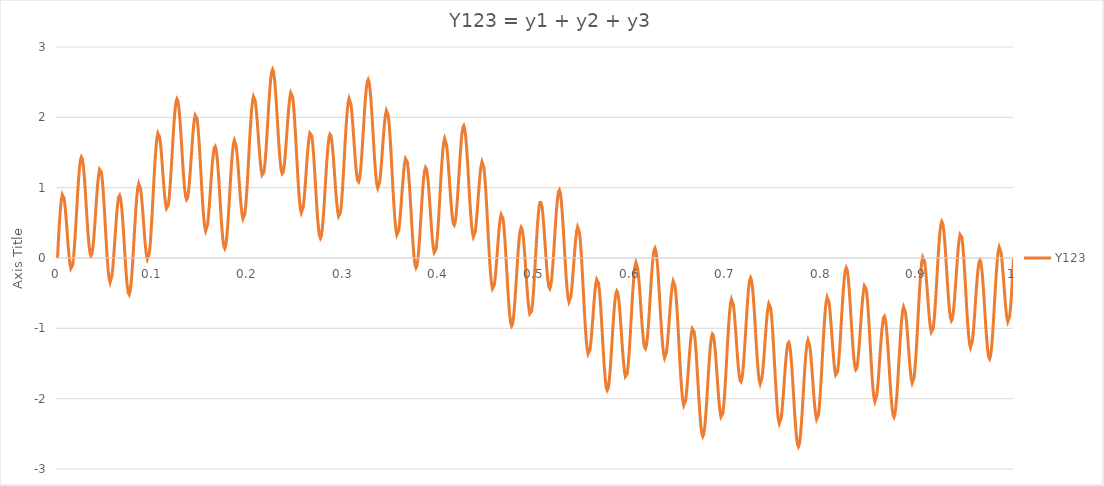
| Category | Y123 |
|---|---|
| 0.0 | 0 |
| 0.001 | 0.257 |
| 0.002 | 0.493 |
| 0.003 | 0.688 |
| 0.004 | 0.828 |
| 0.005 | 0.902 |
| 0.006 | 0.906 |
| 0.007 | 0.845 |
| 0.008 | 0.728 |
| 0.009000000000000001 | 0.569 |
| 0.010000000000000002 | 0.388 |
| 0.011000000000000003 | 0.206 |
| 0.012000000000000004 | 0.044 |
| 0.013000000000000005 | -0.079 |
| 0.014000000000000005 | -0.149 |
| 0.015000000000000006 | -0.154 |
| 0.016000000000000007 | -0.093 |
| 0.017000000000000008 | 0.032 |
| 0.01800000000000001 | 0.21 |
| 0.01900000000000001 | 0.427 |
| 0.02000000000000001 | 0.664 |
| 0.02100000000000001 | 0.898 |
| 0.022000000000000013 | 1.109 |
| 0.023000000000000013 | 1.278 |
| 0.024000000000000014 | 1.39 |
| 0.025000000000000015 | 1.435 |
| 0.026000000000000016 | 1.409 |
| 0.027000000000000017 | 1.316 |
| 0.028000000000000018 | 1.165 |
| 0.02900000000000002 | 0.972 |
| 0.03000000000000002 | 0.757 |
| 0.03100000000000002 | 0.539 |
| 0.03200000000000002 | 0.341 |
| 0.03300000000000002 | 0.181 |
| 0.03400000000000002 | 0.074 |
| 0.035000000000000024 | 0.032 |
| 0.036000000000000025 | 0.056 |
| 0.037000000000000026 | 0.144 |
| 0.03800000000000003 | 0.286 |
| 0.03900000000000003 | 0.466 |
| 0.04000000000000003 | 0.667 |
| 0.04100000000000003 | 0.866 |
| 0.04200000000000003 | 1.044 |
| 0.04300000000000003 | 1.18 |
| 0.04400000000000003 | 1.259 |
| 0.04500000000000003 | 1.273 |
| 0.046000000000000034 | 1.218 |
| 0.047000000000000035 | 1.097 |
| 0.048000000000000036 | 0.92 |
| 0.04900000000000004 | 0.702 |
| 0.05000000000000004 | 0.464 |
| 0.05100000000000004 | 0.225 |
| 0.05200000000000004 | 0.007 |
| 0.05300000000000004 | -0.17 |
| 0.05400000000000004 | -0.291 |
| 0.05500000000000004 | -0.346 |
| 0.05600000000000004 | -0.333 |
| 0.057000000000000044 | -0.253 |
| 0.058000000000000045 | -0.118 |
| 0.059000000000000045 | 0.059 |
| 0.060000000000000046 | 0.258 |
| 0.06100000000000005 | 0.459 |
| 0.06200000000000005 | 0.639 |
| 0.06300000000000004 | 0.78 |
| 0.06400000000000004 | 0.868 |
| 0.06500000000000004 | 0.891 |
| 0.06600000000000004 | 0.848 |
| 0.06700000000000005 | 0.741 |
| 0.06800000000000005 | 0.581 |
| 0.06900000000000005 | 0.382 |
| 0.07000000000000005 | 0.163 |
| 0.07100000000000005 | -0.053 |
| 0.07200000000000005 | -0.247 |
| 0.07300000000000005 | -0.398 |
| 0.07400000000000005 | -0.492 |
| 0.07500000000000005 | -0.519 |
| 0.07600000000000005 | -0.475 |
| 0.07700000000000005 | -0.365 |
| 0.07800000000000006 | -0.197 |
| 0.07900000000000006 | 0.014 |
| 0.08000000000000006 | 0.247 |
| 0.08100000000000006 | 0.482 |
| 0.08200000000000006 | 0.698 |
| 0.08300000000000006 | 0.875 |
| 0.08400000000000006 | 0.999 |
| 0.08500000000000006 | 1.059 |
| 0.08600000000000006 | 1.052 |
| 0.08700000000000006 | 0.982 |
| 0.08800000000000006 | 0.857 |
| 0.08900000000000007 | 0.693 |
| 0.09000000000000007 | 0.51 |
| 0.09100000000000007 | 0.327 |
| 0.09200000000000007 | 0.167 |
| 0.09300000000000007 | 0.048 |
| 0.09400000000000007 | -0.014 |
| 0.09500000000000007 | -0.011 |
| 0.09600000000000007 | 0.061 |
| 0.09700000000000007 | 0.199 |
| 0.09800000000000007 | 0.392 |
| 0.09900000000000007 | 0.626 |
| 0.10000000000000007 | 0.882 |
| 0.10100000000000008 | 1.137 |
| 0.10200000000000008 | 1.371 |
| 0.10300000000000008 | 1.564 |
| 0.10400000000000008 | 1.702 |
| 0.10500000000000008 | 1.774 |
| 0.10600000000000008 | 1.777 |
| 0.10700000000000008 | 1.713 |
| 0.10800000000000008 | 1.594 |
| 0.10900000000000008 | 1.433 |
| 0.11000000000000008 | 1.25 |
| 0.11100000000000008 | 1.066 |
| 0.11200000000000009 | 0.901 |
| 0.11300000000000009 | 0.776 |
| 0.11400000000000009 | 0.704 |
| 0.11500000000000009 | 0.696 |
| 0.11600000000000009 | 0.755 |
| 0.11700000000000009 | 0.878 |
| 0.11800000000000009 | 1.054 |
| 0.11900000000000009 | 1.269 |
| 0.12000000000000009 | 1.502 |
| 0.1210000000000001 | 1.734 |
| 0.1220000000000001 | 1.943 |
| 0.1230000000000001 | 2.11 |
| 0.1240000000000001 | 2.219 |
| 0.12500000000000008 | 2.261 |
| 0.12600000000000008 | 2.232 |
| 0.12700000000000009 | 2.136 |
| 0.12800000000000009 | 1.983 |
| 0.1290000000000001 | 1.788 |
| 0.1300000000000001 | 1.569 |
| 0.1310000000000001 | 1.348 |
| 0.1320000000000001 | 1.147 |
| 0.1330000000000001 | 0.984 |
| 0.1340000000000001 | 0.875 |
| 0.1350000000000001 | 0.83 |
| 0.1360000000000001 | 0.851 |
| 0.1370000000000001 | 0.936 |
| 0.1380000000000001 | 1.074 |
| 0.1390000000000001 | 1.252 |
| 0.1400000000000001 | 1.45 |
| 0.1410000000000001 | 1.646 |
| 0.1420000000000001 | 1.82 |
| 0.1430000000000001 | 1.953 |
| 0.1440000000000001 | 2.029 |
| 0.1450000000000001 | 2.04 |
| 0.1460000000000001 | 1.981 |
| 0.1470000000000001 | 1.857 |
| 0.1480000000000001 | 1.676 |
| 0.1490000000000001 | 1.456 |
| 0.1500000000000001 | 1.214 |
| 0.1510000000000001 | 0.971 |
| 0.1520000000000001 | 0.75 |
| 0.1530000000000001 | 0.57 |
| 0.1540000000000001 | 0.445 |
| 0.1550000000000001 | 0.386 |
| 0.1560000000000001 | 0.396 |
| 0.1570000000000001 | 0.472 |
| 0.1580000000000001 | 0.604 |
| 0.1590000000000001 | 0.777 |
| 0.16000000000000011 | 0.973 |
| 0.16100000000000012 | 1.169 |
| 0.16200000000000012 | 1.346 |
| 0.16300000000000012 | 1.483 |
| 0.16400000000000012 | 1.567 |
| 0.16500000000000012 | 1.587 |
| 0.16600000000000012 | 1.539 |
| 0.16700000000000012 | 1.429 |
| 0.16800000000000012 | 1.264 |
| 0.16900000000000012 | 1.061 |
| 0.17000000000000012 | 0.839 |
| 0.17100000000000012 | 0.618 |
| 0.17200000000000013 | 0.421 |
| 0.17300000000000013 | 0.265 |
| 0.17400000000000013 | 0.167 |
| 0.17500000000000013 | 0.137 |
| 0.17600000000000013 | 0.176 |
| 0.17700000000000013 | 0.283 |
| 0.17800000000000013 | 0.447 |
| 0.17900000000000013 | 0.653 |
| 0.18000000000000013 | 0.882 |
| 0.18100000000000013 | 1.113 |
| 0.18200000000000013 | 1.324 |
| 0.18300000000000013 | 1.497 |
| 0.18400000000000014 | 1.616 |
| 0.18500000000000014 | 1.672 |
| 0.18600000000000014 | 1.661 |
| 0.18700000000000014 | 1.586 |
| 0.18800000000000014 | 1.457 |
| 0.18900000000000014 | 1.289 |
| 0.19000000000000014 | 1.101 |
| 0.19100000000000014 | 0.914 |
| 0.19200000000000014 | 0.749 |
| 0.19300000000000014 | 0.626 |
| 0.19400000000000014 | 0.558 |
| 0.19500000000000015 | 0.557 |
| 0.19600000000000015 | 0.624 |
| 0.19700000000000015 | 0.758 |
| 0.19800000000000015 | 0.947 |
| 0.19900000000000015 | 1.176 |
| 0.20000000000000015 | 1.427 |
| 0.20100000000000015 | 1.677 |
| 0.20200000000000015 | 1.906 |
| 0.20300000000000015 | 2.095 |
| 0.20400000000000015 | 2.228 |
| 0.20500000000000015 | 2.295 |
| 0.20600000000000016 | 2.293 |
| 0.20700000000000016 | 2.225 |
| 0.20800000000000016 | 2.1 |
| 0.20900000000000016 | 1.935 |
| 0.21000000000000016 | 1.747 |
| 0.21100000000000016 | 1.558 |
| 0.21200000000000016 | 1.388 |
| 0.21300000000000016 | 1.258 |
| 0.21400000000000016 | 1.181 |
| 0.21500000000000016 | 1.168 |
| 0.21600000000000016 | 1.222 |
| 0.21700000000000016 | 1.34 |
| 0.21800000000000017 | 1.511 |
| 0.21900000000000017 | 1.72 |
| 0.22000000000000017 | 1.949 |
| 0.22100000000000017 | 2.176 |
| 0.22200000000000017 | 2.379 |
| 0.22300000000000017 | 2.541 |
| 0.22400000000000017 | 2.645 |
| 0.22500000000000017 | 2.682 |
| 0.22600000000000017 | 2.648 |
| 0.22700000000000017 | 2.547 |
| 0.22800000000000017 | 2.388 |
| 0.22900000000000018 | 2.188 |
| 0.23000000000000018 | 1.964 |
| 0.23100000000000018 | 1.738 |
| 0.23200000000000018 | 1.531 |
| 0.23300000000000018 | 1.363 |
| 0.23400000000000018 | 1.249 |
| 0.23500000000000018 | 1.198 |
| 0.23600000000000018 | 1.214 |
| 0.23700000000000018 | 1.293 |
| 0.23800000000000018 | 1.427 |
| 0.23900000000000018 | 1.599 |
| 0.24000000000000019 | 1.791 |
| 0.2410000000000002 | 1.982 |
| 0.2420000000000002 | 2.15 |
| 0.2430000000000002 | 2.278 |
| 0.2440000000000002 | 2.349 |
| 0.2450000000000002 | 2.354 |
| 0.2460000000000002 | 2.29 |
| 0.2470000000000002 | 2.16 |
| 0.2480000000000002 | 1.974 |
| 0.2490000000000002 | 1.748 |
| 0.25000000000000017 | 1.5 |
| 0.25100000000000017 | 1.252 |
| 0.25200000000000017 | 1.026 |
| 0.25300000000000017 | 0.84 |
| 0.25400000000000017 | 0.709 |
| 0.25500000000000017 | 0.645 |
| 0.25600000000000017 | 0.649 |
| 0.2570000000000002 | 0.719 |
| 0.2580000000000002 | 0.846 |
| 0.2590000000000002 | 1.013 |
| 0.2600000000000002 | 1.203 |
| 0.2610000000000002 | 1.394 |
| 0.2620000000000002 | 1.565 |
| 0.2630000000000002 | 1.697 |
| 0.2640000000000002 | 1.775 |
| 0.2650000000000002 | 1.789 |
| 0.2660000000000002 | 1.736 |
| 0.2670000000000002 | 1.62 |
| 0.2680000000000002 | 1.449 |
| 0.2690000000000002 | 1.241 |
| 0.2700000000000002 | 1.013 |
| 0.2710000000000002 | 0.786 |
| 0.2720000000000002 | 0.583 |
| 0.2730000000000002 | 0.422 |
| 0.2740000000000002 | 0.318 |
| 0.2750000000000002 | 0.282 |
| 0.2760000000000002 | 0.315 |
| 0.2770000000000002 | 0.416 |
| 0.2780000000000002 | 0.574 |
| 0.2790000000000002 | 0.775 |
| 0.2800000000000002 | 0.998 |
| 0.2810000000000002 | 1.223 |
| 0.2820000000000002 | 1.429 |
| 0.2830000000000002 | 1.596 |
| 0.2840000000000002 | 1.709 |
| 0.2850000000000002 | 1.759 |
| 0.2860000000000002 | 1.742 |
| 0.2870000000000002 | 1.661 |
| 0.2880000000000002 | 1.527 |
| 0.2890000000000002 | 1.353 |
| 0.2900000000000002 | 1.159 |
| 0.2910000000000002 | 0.966 |
| 0.2920000000000002 | 0.796 |
| 0.2930000000000002 | 0.666 |
| 0.2940000000000002 | 0.593 |
| 0.2950000000000002 | 0.586 |
| 0.2960000000000002 | 0.648 |
| 0.2970000000000002 | 0.775 |
| 0.2980000000000002 | 0.958 |
| 0.2990000000000002 | 1.182 |
| 0.3000000000000002 | 1.427 |
| 0.3010000000000002 | 1.671 |
| 0.3020000000000002 | 1.895 |
| 0.3030000000000002 | 2.078 |
| 0.3040000000000002 | 2.205 |
| 0.3050000000000002 | 2.266 |
| 0.3060000000000002 | 2.258 |
| 0.3070000000000002 | 2.184 |
| 0.3080000000000002 | 2.054 |
| 0.3090000000000002 | 1.882 |
| 0.3100000000000002 | 1.689 |
| 0.3110000000000002 | 1.494 |
| 0.3120000000000002 | 1.318 |
| 0.3130000000000002 | 1.182 |
| 0.3140000000000002 | 1.1 |
| 0.3150000000000002 | 1.081 |
| 0.3160000000000002 | 1.129 |
| 0.3170000000000002 | 1.241 |
| 0.3180000000000002 | 1.406 |
| 0.31900000000000023 | 1.61 |
| 0.32000000000000023 | 1.833 |
| 0.32100000000000023 | 2.054 |
| 0.32200000000000023 | 2.252 |
| 0.32300000000000023 | 2.407 |
| 0.32400000000000023 | 2.506 |
| 0.32500000000000023 | 2.537 |
| 0.32600000000000023 | 2.497 |
| 0.32700000000000023 | 2.39 |
| 0.32800000000000024 | 2.226 |
| 0.32900000000000024 | 2.02 |
| 0.33000000000000024 | 1.79 |
| 0.33100000000000024 | 1.558 |
| 0.33200000000000024 | 1.346 |
| 0.33300000000000024 | 1.172 |
| 0.33400000000000024 | 1.052 |
| 0.33500000000000024 | 0.996 |
| 0.33600000000000024 | 1.006 |
| 0.33700000000000024 | 1.08 |
| 0.33800000000000024 | 1.207 |
| 0.33900000000000025 | 1.374 |
| 0.34000000000000025 | 1.56 |
| 0.34100000000000025 | 1.746 |
| 0.34200000000000025 | 1.909 |
| 0.34300000000000025 | 2.03 |
| 0.34400000000000025 | 2.096 |
| 0.34500000000000025 | 2.095 |
| 0.34600000000000025 | 2.025 |
| 0.34700000000000025 | 1.89 |
| 0.34800000000000025 | 1.699 |
| 0.34900000000000025 | 1.467 |
| 0.35000000000000026 | 1.214 |
| 0.35100000000000026 | 0.96 |
| 0.35200000000000026 | 0.728 |
| 0.35300000000000026 | 0.537 |
| 0.35400000000000026 | 0.401 |
| 0.35500000000000026 | 0.331 |
| 0.35600000000000026 | 0.33 |
| 0.35700000000000026 | 0.394 |
| 0.35800000000000026 | 0.515 |
| 0.35900000000000026 | 0.678 |
| 0.36000000000000026 | 0.862 |
| 0.36100000000000027 | 1.047 |
| 0.36200000000000027 | 1.213 |
| 0.36300000000000027 | 1.339 |
| 0.36400000000000027 | 1.412 |
| 0.36500000000000027 | 1.421 |
| 0.36600000000000027 | 1.362 |
| 0.36700000000000027 | 1.241 |
| 0.36800000000000027 | 1.065 |
| 0.36900000000000027 | 0.851 |
| 0.3700000000000003 | 0.618 |
| 0.3710000000000003 | 0.386 |
| 0.3720000000000003 | 0.178 |
| 0.3730000000000003 | 0.012 |
| 0.3740000000000003 | -0.097 |
| 0.3750000000000003 | -0.139 |
| 0.3760000000000003 | -0.111 |
| 0.3770000000000003 | -0.015 |
| 0.3780000000000003 | 0.138 |
| 0.3790000000000003 | 0.333 |
| 0.3800000000000003 | 0.551 |
| 0.3810000000000003 | 0.771 |
| 0.3820000000000003 | 0.972 |
| 0.3830000000000003 | 1.134 |
| 0.3840000000000003 | 1.243 |
| 0.3850000000000003 | 1.287 |
| 0.3860000000000003 | 1.265 |
| 0.3870000000000003 | 1.18 |
| 0.3880000000000003 | 1.04 |
| 0.3890000000000003 | 0.861 |
| 0.3900000000000003 | 0.662 |
| 0.3910000000000003 | 0.465 |
| 0.3920000000000003 | 0.289 |
| 0.3930000000000003 | 0.155 |
| 0.3940000000000003 | 0.077 |
| 0.3950000000000003 | 0.065 |
| 0.3960000000000003 | 0.122 |
| 0.3970000000000003 | 0.244 |
| 0.3980000000000003 | 0.423 |
| 0.3990000000000003 | 0.642 |
| 0.4000000000000003 | 0.882 |
| 0.4010000000000003 | 1.122 |
| 0.4020000000000003 | 1.34 |
| 0.4030000000000003 | 1.519 |
| 0.4040000000000003 | 1.641 |
| 0.4050000000000003 | 1.698 |
| 0.4060000000000003 | 1.685 |
| 0.4070000000000003 | 1.607 |
| 0.4080000000000003 | 1.472 |
| 0.4090000000000003 | 1.296 |
| 0.4100000000000003 | 1.098 |
| 0.4110000000000003 | 0.898 |
| 0.4120000000000003 | 0.719 |
| 0.4130000000000003 | 0.578 |
| 0.4140000000000003 | 0.491 |
| 0.4150000000000003 | 0.468 |
| 0.4160000000000003 | 0.512 |
| 0.4170000000000003 | 0.619 |
| 0.4180000000000003 | 0.78 |
| 0.4190000000000003 | 0.979 |
| 0.4200000000000003 | 1.198 |
| 0.4210000000000003 | 1.415 |
| 0.4220000000000003 | 1.609 |
| 0.4230000000000003 | 1.76 |
| 0.4240000000000003 | 1.854 |
| 0.4250000000000003 | 1.881 |
| 0.4260000000000003 | 1.837 |
| 0.4270000000000003 | 1.727 |
| 0.4280000000000003 | 1.558 |
| 0.4290000000000003 | 1.348 |
| 0.4300000000000003 | 1.114 |
| 0.4310000000000003 | 0.879 |
| 0.43200000000000033 | 0.663 |
| 0.43300000000000033 | 0.485 |
| 0.43400000000000033 | 0.361 |
| 0.43500000000000033 | 0.3 |
| 0.43600000000000033 | 0.307 |
| 0.43700000000000033 | 0.377 |
| 0.43800000000000033 | 0.5 |
| 0.43900000000000033 | 0.663 |
| 0.44000000000000034 | 0.846 |
| 0.44100000000000034 | 1.028 |
| 0.44200000000000034 | 1.187 |
| 0.44300000000000034 | 1.305 |
| 0.44400000000000034 | 1.367 |
| 0.44500000000000034 | 1.363 |
| 0.44600000000000034 | 1.289 |
| 0.44700000000000034 | 1.15 |
| 0.44800000000000034 | 0.956 |
| 0.44900000000000034 | 0.72 |
| 0.45000000000000034 | 0.464 |
| 0.45100000000000035 | 0.207 |
| 0.45200000000000035 | -0.029 |
| 0.45300000000000035 | -0.223 |
| 0.45400000000000035 | -0.363 |
| 0.45500000000000035 | -0.436 |
| 0.45600000000000035 | -0.44 |
| 0.45700000000000035 | -0.379 |
| 0.45800000000000035 | -0.261 |
| 0.45900000000000035 | -0.102 |
| 0.46000000000000035 | 0.079 |
| 0.46100000000000035 | 0.261 |
| 0.46200000000000035 | 0.424 |
| 0.46300000000000036 | 0.547 |
| 0.46400000000000036 | 0.617 |
| 0.46500000000000036 | 0.623 |
| 0.46600000000000036 | 0.562 |
| 0.46700000000000036 | 0.437 |
| 0.46800000000000036 | 0.259 |
| 0.46900000000000036 | 0.042 |
| 0.47000000000000036 | -0.194 |
| 0.47100000000000036 | -0.429 |
| 0.47200000000000036 | -0.64 |
| 0.47300000000000036 | -0.809 |
| 0.47400000000000037 | -0.921 |
| 0.47500000000000037 | -0.965 |
| 0.47600000000000037 | -0.939 |
| 0.47700000000000037 | -0.846 |
| 0.47800000000000037 | -0.696 |
| 0.47900000000000037 | -0.503 |
| 0.48000000000000037 | -0.288 |
| 0.48100000000000037 | -0.07 |
| 0.4820000000000004 | 0.128 |
| 0.4830000000000004 | 0.288 |
| 0.4840000000000004 | 0.394 |
| 0.4850000000000004 | 0.437 |
| 0.4860000000000004 | 0.412 |
| 0.4870000000000004 | 0.324 |
| 0.4880000000000004 | 0.182 |
| 0.4890000000000004 | 0.001 |
| 0.4900000000000004 | -0.2 |
| 0.4910000000000004 | -0.399 |
| 0.4920000000000004 | -0.577 |
| 0.4930000000000004 | -0.713 |
| 0.4940000000000004 | -0.793 |
| 0.4950000000000004 | -0.807 |
| 0.4960000000000004 | -0.752 |
| 0.4970000000000004 | -0.632 |
| 0.4980000000000004 | -0.455 |
| 0.4990000000000004 | -0.238 |
| 0.5000000000000003 | 0 |
| 0.5010000000000003 | 0.238 |
| 0.5020000000000003 | 0.455 |
| 0.5030000000000003 | 0.632 |
| 0.5040000000000003 | 0.752 |
| 0.5050000000000003 | 0.807 |
| 0.5060000000000003 | 0.793 |
| 0.5070000000000003 | 0.713 |
| 0.5080000000000003 | 0.577 |
| 0.5090000000000003 | 0.399 |
| 0.5100000000000003 | 0.2 |
| 0.5110000000000003 | -0.001 |
| 0.5120000000000003 | -0.182 |
| 0.5130000000000003 | -0.324 |
| 0.5140000000000003 | -0.412 |
| 0.5150000000000003 | -0.437 |
| 0.5160000000000003 | -0.394 |
| 0.5170000000000003 | -0.288 |
| 0.5180000000000003 | -0.128 |
| 0.5190000000000003 | 0.07 |
| 0.5200000000000004 | 0.288 |
| 0.5210000000000004 | 0.503 |
| 0.5220000000000004 | 0.696 |
| 0.5230000000000004 | 0.846 |
| 0.5240000000000004 | 0.939 |
| 0.5250000000000004 | 0.965 |
| 0.5260000000000004 | 0.921 |
| 0.5270000000000004 | 0.809 |
| 0.5280000000000004 | 0.64 |
| 0.5290000000000004 | 0.429 |
| 0.5300000000000004 | 0.194 |
| 0.5310000000000004 | -0.042 |
| 0.5320000000000004 | -0.259 |
| 0.5330000000000004 | -0.437 |
| 0.5340000000000004 | -0.562 |
| 0.5350000000000004 | -0.623 |
| 0.5360000000000004 | -0.617 |
| 0.5370000000000004 | -0.547 |
| 0.5380000000000004 | -0.424 |
| 0.5390000000000004 | -0.261 |
| 0.5400000000000004 | -0.079 |
| 0.5410000000000004 | 0.102 |
| 0.5420000000000004 | 0.261 |
| 0.5430000000000004 | 0.379 |
| 0.5440000000000004 | 0.44 |
| 0.5450000000000004 | 0.436 |
| 0.5460000000000004 | 0.363 |
| 0.5470000000000004 | 0.223 |
| 0.5480000000000004 | 0.029 |
| 0.5490000000000004 | -0.207 |
| 0.5500000000000004 | -0.464 |
| 0.5510000000000004 | -0.72 |
| 0.5520000000000004 | -0.956 |
| 0.5530000000000004 | -1.15 |
| 0.5540000000000004 | -1.289 |
| 0.5550000000000004 | -1.363 |
| 0.5560000000000004 | -1.367 |
| 0.5570000000000004 | -1.305 |
| 0.5580000000000004 | -1.187 |
| 0.5590000000000004 | -1.028 |
| 0.5600000000000004 | -0.846 |
| 0.5610000000000004 | -0.663 |
| 0.5620000000000004 | -0.5 |
| 0.5630000000000004 | -0.377 |
| 0.5640000000000004 | -0.307 |
| 0.5650000000000004 | -0.3 |
| 0.5660000000000004 | -0.361 |
| 0.5670000000000004 | -0.485 |
| 0.5680000000000004 | -0.663 |
| 0.5690000000000004 | -0.879 |
| 0.5700000000000004 | -1.114 |
| 0.5710000000000004 | -1.348 |
| 0.5720000000000004 | -1.558 |
| 0.5730000000000004 | -1.727 |
| 0.5740000000000004 | -1.837 |
| 0.5750000000000004 | -1.881 |
| 0.5760000000000004 | -1.854 |
| 0.5770000000000004 | -1.76 |
| 0.5780000000000004 | -1.609 |
| 0.5790000000000004 | -1.415 |
| 0.5800000000000004 | -1.198 |
| 0.5810000000000004 | -0.979 |
| 0.5820000000000004 | -0.78 |
| 0.5830000000000004 | -0.619 |
| 0.5840000000000004 | -0.512 |
| 0.5850000000000004 | -0.468 |
| 0.5860000000000004 | -0.491 |
| 0.5870000000000004 | -0.578 |
| 0.5880000000000004 | -0.719 |
| 0.5890000000000004 | -0.898 |
| 0.5900000000000004 | -1.098 |
| 0.5910000000000004 | -1.296 |
| 0.5920000000000004 | -1.472 |
| 0.5930000000000004 | -1.607 |
| 0.5940000000000004 | -1.685 |
| 0.5950000000000004 | -1.698 |
| 0.5960000000000004 | -1.641 |
| 0.5970000000000004 | -1.519 |
| 0.5980000000000004 | -1.34 |
| 0.5990000000000004 | -1.122 |
| 0.6000000000000004 | -0.882 |
| 0.6010000000000004 | -0.642 |
| 0.6020000000000004 | -0.423 |
| 0.6030000000000004 | -0.244 |
| 0.6040000000000004 | -0.122 |
| 0.6050000000000004 | -0.065 |
| 0.6060000000000004 | -0.077 |
| 0.6070000000000004 | -0.155 |
| 0.6080000000000004 | -0.289 |
| 0.6090000000000004 | -0.465 |
| 0.6100000000000004 | -0.662 |
| 0.6110000000000004 | -0.861 |
| 0.6120000000000004 | -1.04 |
| 0.6130000000000004 | -1.18 |
| 0.6140000000000004 | -1.265 |
| 0.6150000000000004 | -1.287 |
| 0.6160000000000004 | -1.243 |
| 0.6170000000000004 | -1.134 |
| 0.6180000000000004 | -0.972 |
| 0.6190000000000004 | -0.771 |
| 0.6200000000000004 | -0.551 |
| 0.6210000000000004 | -0.333 |
| 0.6220000000000004 | -0.138 |
| 0.6230000000000004 | 0.015 |
| 0.6240000000000004 | 0.111 |
| 0.6250000000000004 | 0.139 |
| 0.6260000000000004 | 0.097 |
| 0.6270000000000004 | -0.012 |
| 0.6280000000000004 | -0.178 |
| 0.6290000000000004 | -0.386 |
| 0.6300000000000004 | -0.618 |
| 0.6310000000000004 | -0.851 |
| 0.6320000000000005 | -1.065 |
| 0.6330000000000005 | -1.241 |
| 0.6340000000000005 | -1.362 |
| 0.6350000000000005 | -1.421 |
| 0.6360000000000005 | -1.412 |
| 0.6370000000000005 | -1.339 |
| 0.6380000000000005 | -1.213 |
| 0.6390000000000005 | -1.047 |
| 0.6400000000000005 | -0.862 |
| 0.6410000000000005 | -0.678 |
| 0.6420000000000005 | -0.515 |
| 0.6430000000000005 | -0.394 |
| 0.6440000000000005 | -0.33 |
| 0.6450000000000005 | -0.331 |
| 0.6460000000000005 | -0.401 |
| 0.6470000000000005 | -0.537 |
| 0.6480000000000005 | -0.728 |
| 0.6490000000000005 | -0.96 |
| 0.6500000000000005 | -1.214 |
| 0.6510000000000005 | -1.467 |
| 0.6520000000000005 | -1.699 |
| 0.6530000000000005 | -1.89 |
| 0.6540000000000005 | -2.025 |
| 0.6550000000000005 | -2.095 |
| 0.6560000000000005 | -2.096 |
| 0.6570000000000005 | -2.03 |
| 0.6580000000000005 | -1.909 |
| 0.6590000000000005 | -1.746 |
| 0.6600000000000005 | -1.56 |
| 0.6610000000000005 | -1.374 |
| 0.6620000000000005 | -1.207 |
| 0.6630000000000005 | -1.08 |
| 0.6640000000000005 | -1.006 |
| 0.6650000000000005 | -0.996 |
| 0.6660000000000005 | -1.052 |
| 0.6670000000000005 | -1.172 |
| 0.6680000000000005 | -1.346 |
| 0.6690000000000005 | -1.558 |
| 0.6700000000000005 | -1.79 |
| 0.6710000000000005 | -2.02 |
| 0.6720000000000005 | -2.226 |
| 0.6730000000000005 | -2.39 |
| 0.6740000000000005 | -2.497 |
| 0.6750000000000005 | -2.537 |
| 0.6760000000000005 | -2.506 |
| 0.6770000000000005 | -2.407 |
| 0.6780000000000005 | -2.252 |
| 0.6790000000000005 | -2.054 |
| 0.6800000000000005 | -1.833 |
| 0.6810000000000005 | -1.61 |
| 0.6820000000000005 | -1.406 |
| 0.6830000000000005 | -1.241 |
| 0.6840000000000005 | -1.129 |
| 0.6850000000000005 | -1.081 |
| 0.6860000000000005 | -1.1 |
| 0.6870000000000005 | -1.182 |
| 0.6880000000000005 | -1.318 |
| 0.6890000000000005 | -1.494 |
| 0.6900000000000005 | -1.689 |
| 0.6910000000000005 | -1.882 |
| 0.6920000000000005 | -2.054 |
| 0.6930000000000005 | -2.184 |
| 0.6940000000000005 | -2.258 |
| 0.6950000000000005 | -2.266 |
| 0.6960000000000005 | -2.205 |
| 0.6970000000000005 | -2.078 |
| 0.6980000000000005 | -1.895 |
| 0.6990000000000005 | -1.671 |
| 0.7000000000000005 | -1.427 |
| 0.7010000000000005 | -1.182 |
| 0.7020000000000005 | -0.958 |
| 0.7030000000000005 | -0.775 |
| 0.7040000000000005 | -0.648 |
| 0.7050000000000005 | -0.586 |
| 0.7060000000000005 | -0.593 |
| 0.7070000000000005 | -0.666 |
| 0.7080000000000005 | -0.796 |
| 0.7090000000000005 | -0.966 |
| 0.7100000000000005 | -1.159 |
| 0.7110000000000005 | -1.353 |
| 0.7120000000000005 | -1.527 |
| 0.7130000000000005 | -1.661 |
| 0.7140000000000005 | -1.742 |
| 0.7150000000000005 | -1.759 |
| 0.7160000000000005 | -1.709 |
| 0.7170000000000005 | -1.596 |
| 0.7180000000000005 | -1.429 |
| 0.7190000000000005 | -1.223 |
| 0.7200000000000005 | -0.998 |
| 0.7210000000000005 | -0.775 |
| 0.7220000000000005 | -0.574 |
| 0.7230000000000005 | -0.416 |
| 0.7240000000000005 | -0.315 |
| 0.7250000000000005 | -0.282 |
| 0.7260000000000005 | -0.318 |
| 0.7270000000000005 | -0.422 |
| 0.7280000000000005 | -0.583 |
| 0.7290000000000005 | -0.786 |
| 0.7300000000000005 | -1.013 |
| 0.7310000000000005 | -1.241 |
| 0.7320000000000005 | -1.449 |
| 0.7330000000000005 | -1.62 |
| 0.7340000000000005 | -1.736 |
| 0.7350000000000005 | -1.789 |
| 0.7360000000000005 | -1.775 |
| 0.7370000000000005 | -1.697 |
| 0.7380000000000005 | -1.565 |
| 0.7390000000000005 | -1.394 |
| 0.7400000000000005 | -1.203 |
| 0.7410000000000005 | -1.013 |
| 0.7420000000000005 | -0.846 |
| 0.7430000000000005 | -0.719 |
| 0.7440000000000005 | -0.649 |
| 0.7450000000000006 | -0.645 |
| 0.7460000000000006 | -0.709 |
| 0.7470000000000006 | -0.84 |
| 0.7480000000000006 | -1.026 |
| 0.7490000000000006 | -1.252 |
| 0.7500000000000006 | -1.5 |
| 0.7510000000000006 | -1.748 |
| 0.7520000000000006 | -1.974 |
| 0.7530000000000006 | -2.16 |
| 0.7540000000000006 | -2.29 |
| 0.7550000000000006 | -2.354 |
| 0.7560000000000006 | -2.349 |
| 0.7570000000000006 | -2.278 |
| 0.7580000000000006 | -2.15 |
| 0.7590000000000006 | -1.982 |
| 0.7600000000000006 | -1.791 |
| 0.7610000000000006 | -1.599 |
| 0.7620000000000006 | -1.427 |
| 0.7630000000000006 | -1.293 |
| 0.7640000000000006 | -1.214 |
| 0.7650000000000006 | -1.198 |
| 0.7660000000000006 | -1.249 |
| 0.7670000000000006 | -1.363 |
| 0.7680000000000006 | -1.531 |
| 0.7690000000000006 | -1.738 |
| 0.7700000000000006 | -1.964 |
| 0.7710000000000006 | -2.188 |
| 0.7720000000000006 | -2.388 |
| 0.7730000000000006 | -2.547 |
| 0.7740000000000006 | -2.648 |
| 0.7750000000000006 | -2.682 |
| 0.7760000000000006 | -2.645 |
| 0.7770000000000006 | -2.541 |
| 0.7780000000000006 | -2.379 |
| 0.7790000000000006 | -2.176 |
| 0.7800000000000006 | -1.949 |
| 0.7810000000000006 | -1.72 |
| 0.7820000000000006 | -1.511 |
| 0.7830000000000006 | -1.34 |
| 0.7840000000000006 | -1.222 |
| 0.7850000000000006 | -1.168 |
| 0.7860000000000006 | -1.181 |
| 0.7870000000000006 | -1.258 |
| 0.7880000000000006 | -1.388 |
| 0.7890000000000006 | -1.558 |
| 0.7900000000000006 | -1.747 |
| 0.7910000000000006 | -1.935 |
| 0.7920000000000006 | -2.1 |
| 0.7930000000000006 | -2.225 |
| 0.7940000000000006 | -2.293 |
| 0.7950000000000006 | -2.295 |
| 0.7960000000000006 | -2.228 |
| 0.7970000000000006 | -2.095 |
| 0.7980000000000006 | -1.906 |
| 0.7990000000000006 | -1.677 |
| 0.8000000000000006 | -1.427 |
| 0.8010000000000006 | -1.176 |
| 0.8020000000000006 | -0.947 |
| 0.8030000000000006 | -0.758 |
| 0.8040000000000006 | -0.624 |
| 0.8050000000000006 | -0.557 |
| 0.8060000000000006 | -0.558 |
| 0.8070000000000006 | -0.626 |
| 0.8080000000000006 | -0.749 |
| 0.8090000000000006 | -0.914 |
| 0.8100000000000006 | -1.101 |
| 0.8110000000000006 | -1.289 |
| 0.8120000000000006 | -1.457 |
| 0.8130000000000006 | -1.586 |
| 0.8140000000000006 | -1.661 |
| 0.8150000000000006 | -1.672 |
| 0.8160000000000006 | -1.616 |
| 0.8170000000000006 | -1.497 |
| 0.8180000000000006 | -1.324 |
| 0.8190000000000006 | -1.113 |
| 0.8200000000000006 | -0.882 |
| 0.8210000000000006 | -0.653 |
| 0.8220000000000006 | -0.447 |
| 0.8230000000000006 | -0.283 |
| 0.8240000000000006 | -0.176 |
| 0.8250000000000006 | -0.137 |
| 0.8260000000000006 | -0.167 |
| 0.8270000000000006 | -0.265 |
| 0.8280000000000006 | -0.421 |
| 0.8290000000000006 | -0.618 |
| 0.8300000000000006 | -0.839 |
| 0.8310000000000006 | -1.061 |
| 0.8320000000000006 | -1.264 |
| 0.8330000000000006 | -1.429 |
| 0.8340000000000006 | -1.539 |
| 0.8350000000000006 | -1.587 |
| 0.8360000000000006 | -1.567 |
| 0.8370000000000006 | -1.483 |
| 0.8380000000000006 | -1.346 |
| 0.8390000000000006 | -1.169 |
| 0.8400000000000006 | -0.973 |
| 0.8410000000000006 | -0.777 |
| 0.8420000000000006 | -0.604 |
| 0.8430000000000006 | -0.472 |
| 0.8440000000000006 | -0.396 |
| 0.8450000000000006 | -0.386 |
| 0.8460000000000006 | -0.445 |
| 0.8470000000000006 | -0.57 |
| 0.8480000000000006 | -0.75 |
| 0.8490000000000006 | -0.971 |
| 0.8500000000000006 | -1.214 |
| 0.8510000000000006 | -1.456 |
| 0.8520000000000006 | -1.676 |
| 0.8530000000000006 | -1.857 |
| 0.8540000000000006 | -1.981 |
| 0.8550000000000006 | -2.04 |
| 0.8560000000000006 | -2.029 |
| 0.8570000000000007 | -1.953 |
| 0.8580000000000007 | -1.82 |
| 0.8590000000000007 | -1.646 |
| 0.8600000000000007 | -1.45 |
| 0.8610000000000007 | -1.252 |
| 0.8620000000000007 | -1.074 |
| 0.8630000000000007 | -0.936 |
| 0.8640000000000007 | -0.851 |
| 0.8650000000000007 | -0.83 |
| 0.8660000000000007 | -0.875 |
| 0.8670000000000007 | -0.984 |
| 0.8680000000000007 | -1.147 |
| 0.8690000000000007 | -1.348 |
| 0.8700000000000007 | -1.569 |
| 0.8710000000000007 | -1.788 |
| 0.8720000000000007 | -1.983 |
| 0.8730000000000007 | -2.136 |
| 0.8740000000000007 | -2.232 |
| 0.8750000000000007 | -2.261 |
| 0.8760000000000007 | -2.219 |
| 0.8770000000000007 | -2.11 |
| 0.8780000000000007 | -1.943 |
| 0.8790000000000007 | -1.734 |
| 0.8800000000000007 | -1.502 |
| 0.8810000000000007 | -1.269 |
| 0.8820000000000007 | -1.054 |
| 0.8830000000000007 | -0.878 |
| 0.8840000000000007 | -0.755 |
| 0.8850000000000007 | -0.696 |
| 0.8860000000000007 | -0.704 |
| 0.8870000000000007 | -0.776 |
| 0.8880000000000007 | -0.901 |
| 0.8890000000000007 | -1.066 |
| 0.8900000000000007 | -1.25 |
| 0.8910000000000007 | -1.433 |
| 0.8920000000000007 | -1.594 |
| 0.8930000000000007 | -1.713 |
| 0.8940000000000007 | -1.777 |
| 0.8950000000000007 | -1.774 |
| 0.8960000000000007 | -1.702 |
| 0.8970000000000007 | -1.564 |
| 0.8980000000000007 | -1.371 |
| 0.8990000000000007 | -1.137 |
| 0.9000000000000007 | -0.882 |
| 0.9010000000000007 | -0.626 |
| 0.9020000000000007 | -0.392 |
| 0.9030000000000007 | -0.199 |
| 0.9040000000000007 | -0.061 |
| 0.9050000000000007 | 0.011 |
| 0.9060000000000007 | 0.014 |
| 0.9070000000000007 | -0.048 |
| 0.9080000000000007 | -0.167 |
| 0.9090000000000007 | -0.327 |
| 0.9100000000000007 | -0.51 |
| 0.9110000000000007 | -0.693 |
| 0.9120000000000007 | -0.857 |
| 0.9130000000000007 | -0.982 |
| 0.9140000000000007 | -1.052 |
| 0.9150000000000007 | -1.059 |
| 0.9160000000000007 | -0.999 |
| 0.9170000000000007 | -0.875 |
| 0.9180000000000007 | -0.698 |
| 0.9190000000000007 | -0.482 |
| 0.9200000000000007 | -0.247 |
| 0.9210000000000007 | -0.014 |
| 0.9220000000000007 | 0.197 |
| 0.9230000000000007 | 0.365 |
| 0.9240000000000007 | 0.475 |
| 0.9250000000000007 | 0.519 |
| 0.9260000000000007 | 0.492 |
| 0.9270000000000007 | 0.398 |
| 0.9280000000000007 | 0.247 |
| 0.9290000000000007 | 0.053 |
| 0.9300000000000007 | -0.163 |
| 0.9310000000000007 | -0.382 |
| 0.9320000000000007 | -0.581 |
| 0.9330000000000007 | -0.741 |
| 0.9340000000000007 | -0.848 |
| 0.9350000000000007 | -0.891 |
| 0.9360000000000007 | -0.868 |
| 0.9370000000000007 | -0.78 |
| 0.9380000000000007 | -0.639 |
| 0.9390000000000007 | -0.459 |
| 0.9400000000000007 | -0.258 |
| 0.9410000000000007 | -0.059 |
| 0.9420000000000007 | 0.118 |
| 0.9430000000000007 | 0.253 |
| 0.9440000000000007 | 0.333 |
| 0.9450000000000007 | 0.346 |
| 0.9460000000000007 | 0.291 |
| 0.9470000000000007 | 0.17 |
| 0.9480000000000007 | -0.007 |
| 0.9490000000000007 | -0.225 |
| 0.9500000000000007 | -0.464 |
| 0.9510000000000007 | -0.702 |
| 0.9520000000000007 | -0.92 |
| 0.9530000000000007 | -1.097 |
| 0.9540000000000007 | -1.218 |
| 0.9550000000000007 | -1.273 |
| 0.9560000000000007 | -1.259 |
| 0.9570000000000007 | -1.18 |
| 0.9580000000000007 | -1.044 |
| 0.9590000000000007 | -0.866 |
| 0.9600000000000007 | -0.667 |
| 0.9610000000000007 | -0.466 |
| 0.9620000000000007 | -0.286 |
| 0.9630000000000007 | -0.144 |
| 0.9640000000000007 | -0.056 |
| 0.9650000000000007 | -0.032 |
| 0.9660000000000007 | -0.074 |
| 0.9670000000000007 | -0.181 |
| 0.9680000000000007 | -0.341 |
| 0.9690000000000007 | -0.539 |
| 0.9700000000000008 | -0.757 |
| 0.9710000000000008 | -0.972 |
| 0.9720000000000008 | -1.165 |
| 0.9730000000000008 | -1.316 |
| 0.9740000000000008 | -1.409 |
| 0.9750000000000008 | -1.435 |
| 0.9760000000000008 | -1.39 |
| 0.9770000000000008 | -1.278 |
| 0.9780000000000008 | -1.109 |
| 0.9790000000000008 | -0.898 |
| 0.9800000000000008 | -0.664 |
| 0.9810000000000008 | -0.427 |
| 0.9820000000000008 | -0.21 |
| 0.9830000000000008 | -0.032 |
| 0.9840000000000008 | 0.093 |
| 0.9850000000000008 | 0.154 |
| 0.9860000000000008 | 0.149 |
| 0.9870000000000008 | 0.079 |
| 0.9880000000000008 | -0.044 |
| 0.9890000000000008 | -0.206 |
| 0.9900000000000008 | -0.388 |
| 0.9910000000000008 | -0.569 |
| 0.9920000000000008 | -0.728 |
| 0.9930000000000008 | -0.845 |
| 0.9940000000000008 | -0.906 |
| 0.9950000000000008 | -0.902 |
| 0.9960000000000008 | -0.828 |
| 0.9970000000000008 | -0.688 |
| 0.9980000000000008 | -0.493 |
| 0.9990000000000008 | -0.257 |
| 1.0000000000000007 | 0 |